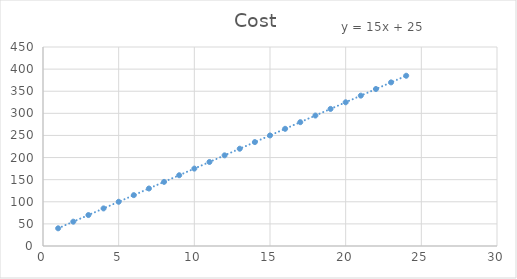
| Category | Cost |
|---|---|
| 1.0 | 40 |
| 2.0 | 55 |
| 3.0 | 70 |
| 4.0 | 85 |
| 5.0 | 100 |
| 6.0 | 115 |
| 7.0 | 130 |
| 8.0 | 145 |
| 9.0 | 160 |
| 10.0 | 175 |
| 11.0 | 190 |
| 12.0 | 205 |
| 13.0 | 220 |
| 14.0 | 235 |
| 15.0 | 250 |
| 16.0 | 265 |
| 17.0 | 280 |
| 18.0 | 295 |
| 19.0 | 310 |
| 20.0 | 325 |
| 21.0 | 340 |
| 22.0 | 355 |
| 23.0 | 370 |
| 24.0 | 385 |